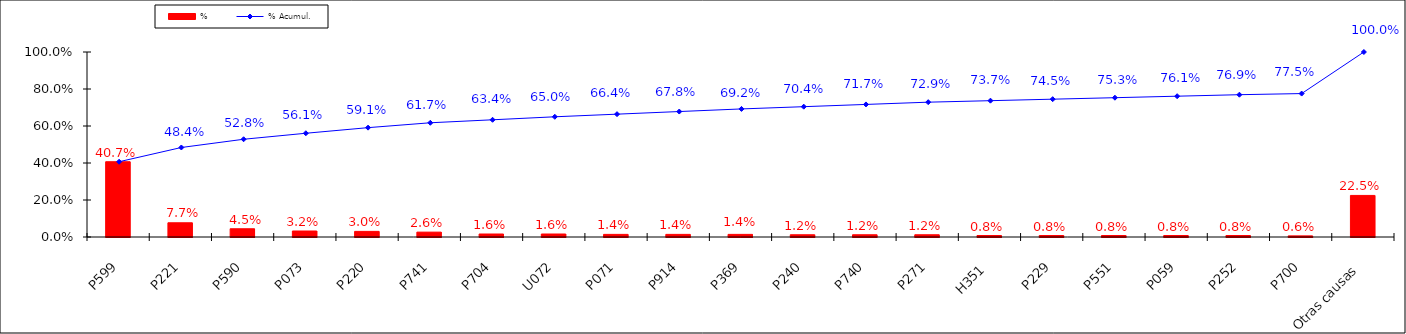
| Category | % |
|---|---|
| P599 | 0.407 |
| P221 | 0.077 |
| P590 | 0.045 |
| P073 | 0.032 |
| P220 | 0.03 |
| P741 | 0.026 |
| P704 | 0.016 |
| U072 | 0.016 |
| P071 | 0.014 |
| P914 | 0.014 |
| P369 | 0.014 |
| P240 | 0.012 |
| P740 | 0.012 |
| P271 | 0.012 |
| H351 | 0.008 |
| P229 | 0.008 |
| P551 | 0.008 |
| P059 | 0.008 |
| P252 | 0.008 |
| P700 | 0.006 |
| Otras causas | 0.225 |